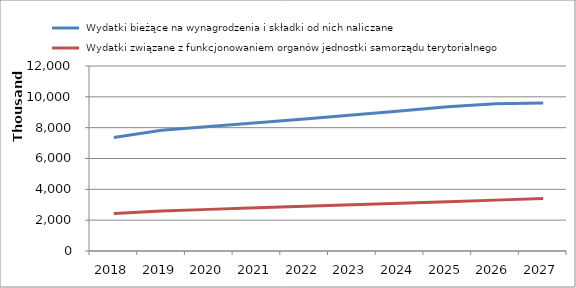
| Category |  Wydatki bieżące na wynagrodzenia i składki od nich naliczane |  Wydatki związane z funkcjonowaniem organów jednostki samorządu terytorialnego |
|---|---|---|
| 2018.0 | 7358248 | 2427609 |
| 2019.0 | 7835311 | 2600000 |
| 2020.0 | 8070371 | 2700000 |
| 2021.0 | 8312482 | 2800000 |
| 2022.0 | 8561856 | 2900000 |
| 2023.0 | 8818712 | 3000000 |
| 2024.0 | 9083273 | 3100000 |
| 2025.0 | 9355771 | 3200000 |
| 2026.0 | 9555771 | 3300000 |
| 2027.0 | 9600000 | 3400000 |